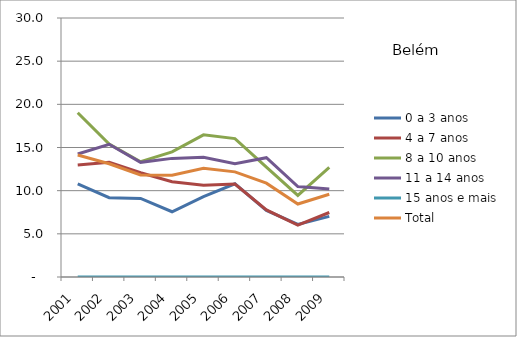
| Category | 0 a 3 anos | 4 a 7 anos | 8 a 10 anos | 11 a 14 anos | 15 anos e mais | Total |
|---|---|---|---|---|---|---|
| 2001.0 | 10.78 | 12.97 | 19.02 | 14.25 | 0 | 14.13 |
| 2002.0 | 9.18 | 13.3 | 15.39 | 15.37 | 0 | 13.12 |
| 2003.0 | 9.1 | 12.08 | 13.35 | 13.28 | 0 | 11.82 |
| 2004.0 | 7.56 | 11.03 | 14.5 | 13.74 | 0 | 11.8 |
| 2005.0 | 9.32 | 10.62 | 16.47 | 13.86 | 0 | 12.59 |
| 2006.0 | 10.8 | 10.77 | 16.03 | 13.12 | 0 | 12.18 |
| 2007.0 | 7.71 | 7.77 | 12.72 | 13.82 | 0 | 10.87 |
| 2008.0 | 6.09 | 6.02 | 9.45 | 10.48 | 0 | 8.45 |
| 2009.0 | 7.02 | 7.47 | 12.69 | 10.18 | 0 | 9.58 |